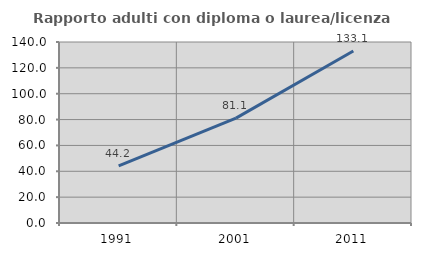
| Category | Rapporto adulti con diploma o laurea/licenza media  |
|---|---|
| 1991.0 | 44.224 |
| 2001.0 | 81.132 |
| 2011.0 | 133.092 |